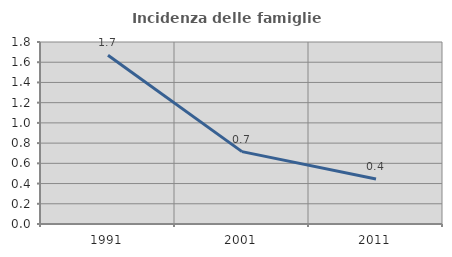
| Category | Incidenza delle famiglie numerose |
|---|---|
| 1991.0 | 1.67 |
| 2001.0 | 0.716 |
| 2011.0 | 0.445 |